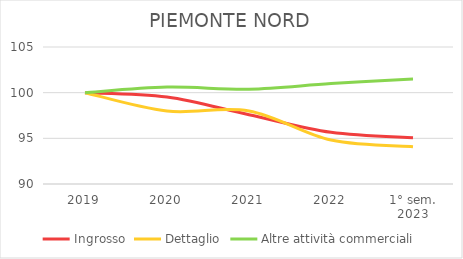
| Category | Ingrosso | Dettaglio | Altre attività commerciali |
|---|---|---|---|
| 2019 | 100 | 100 | 100 |
| 2020 | 99.533 | 97.99 | 100.61 |
| 2021 | 97.589 | 97.99 | 100.381 |
| 2022 | 95.66 | 94.81 | 100.99 |
| 1° sem.
2023 | 95.057 | 94.092 | 101.486 |